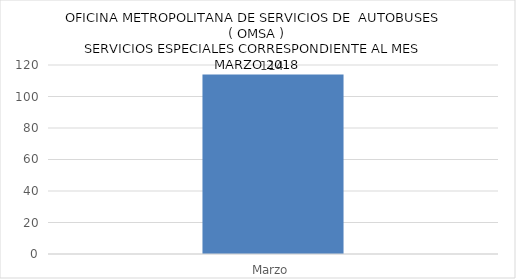
| Category | Cantidad |
|---|---|
| Marzo | 114 |